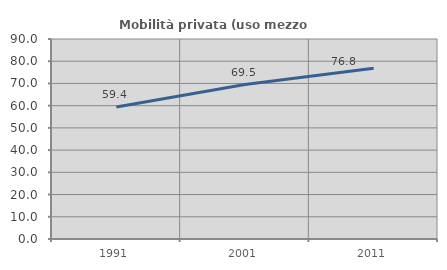
| Category | Mobilità privata (uso mezzo privato) |
|---|---|
| 1991.0 | 59.439 |
| 2001.0 | 69.481 |
| 2011.0 | 76.793 |